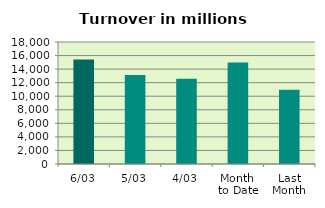
| Category | Series 0 |
|---|---|
| 6/03 | 15435.237 |
| 5/03 | 13148.542 |
| 4/03 | 12560.489 |
| Month 
to Date | 14963.361 |
| Last
Month | 10948.033 |